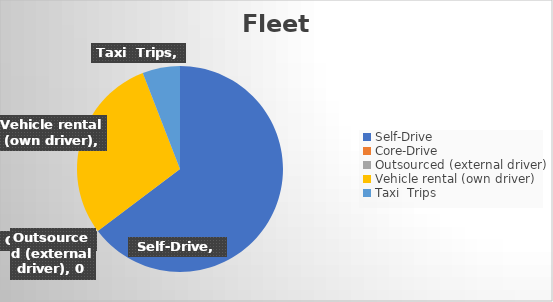
| Category | Fleet |
|---|---|
| Self-Drive | 11 |
| Core-Drive | 0 |
| Outsourced (external driver) | 0 |
| Vehicle rental (own driver) | 5 |
| Taxi  Trips | 1 |